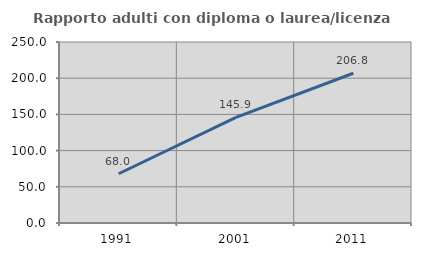
| Category | Rapporto adulti con diploma o laurea/licenza media  |
|---|---|
| 1991.0 | 68.027 |
| 2001.0 | 145.902 |
| 2011.0 | 206.801 |